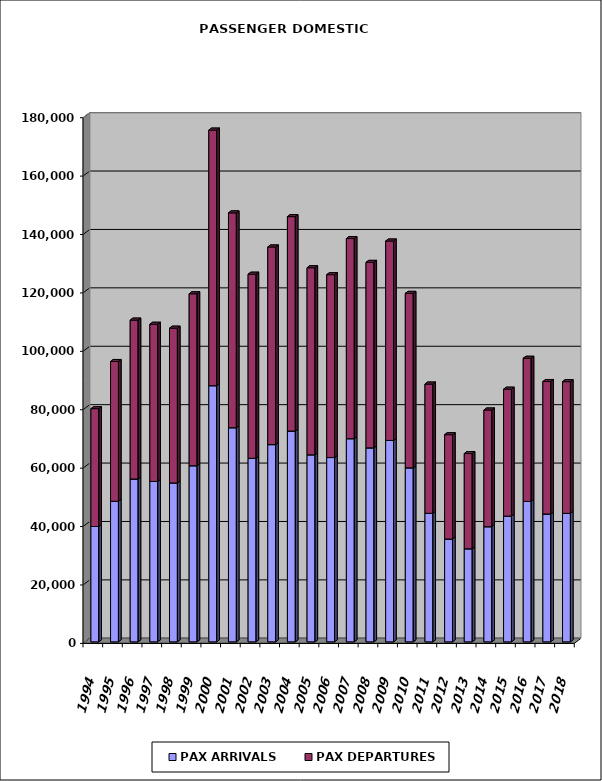
| Category | PAX ARRIVALS | PAX DEPARTURES |
|---|---|---|
| 1994.0 | 39502 | 40342 |
| 1995.0 | 48134 | 47860 |
| 1996.0 | 55761 | 54404 |
| 1997.0 | 54936 | 53809 |
| 1998.0 | 54420 | 52990 |
| 1999.0 | 60310 | 58886 |
| 2000.0 | 87720 | 87520 |
| 2001.0 | 73327 | 73561 |
| 2002.0 | 62851 | 63043 |
| 2003.0 | 67544 | 67662 |
| 2004.0 | 72185 | 73417 |
| 2005.0 | 64049 | 64051 |
| 2006.0 | 63112 | 62619 |
| 2007.0 | 69569 | 68535 |
| 2008.0 | 66425 | 63514 |
| 2009.0 | 68977 | 68276 |
| 2010.0 | 59579 | 59750 |
| 2011.0 | 44016 | 44255 |
| 2012.0 | 35208 | 35729 |
| 2013.0 | 31866 | 32613 |
| 2014.0 | 39424 | 39965 |
| 2015.0 | 43048 | 43467 |
| 2016.0 | 48083 | 49022 |
| 2017.0 | 43775 | 45366 |
| 2018.0 | 44009 | 45087 |